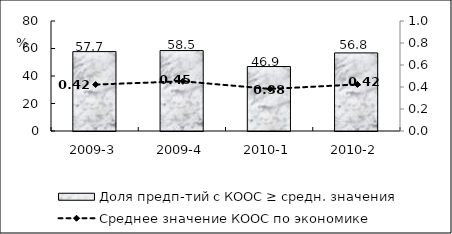
| Category | Доля предп-тий с КООС ≥ средн. значения  |
|---|---|
| 2009-3 | 57.74 |
| 2009-4 | 58.51 |
| 2010-1 | 46.89 |
| 2010-2 | 56.8 |